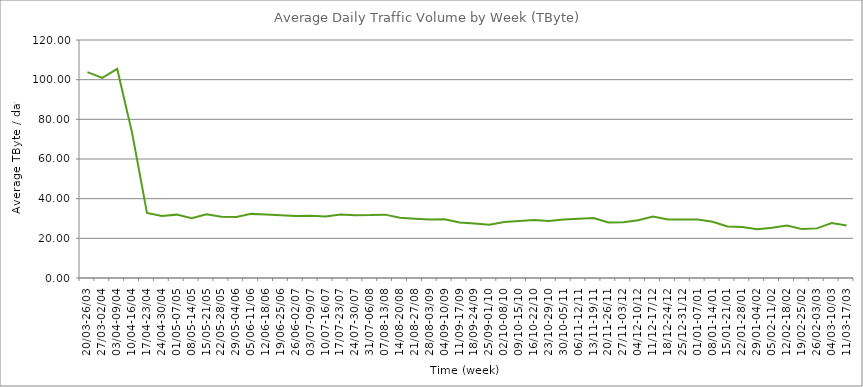
| Category | Average |
|---|---|
| 20/03-26/03 | 103.77 |
| 27/03-02/04 | 100.93 |
| 03/04-09/04 | 105.42 |
| 10/04-16/04 | 73.17 |
| 17/04-23/04 | 32.84 |
| 24/04-30/04 | 31.3 |
| 01/05-07/05 | 31.95 |
| 08/05-14/05 | 30.09 |
| 15/05-21/05 | 32.17 |
| 22/05-28/05 | 30.88 |
| 29/05-04/06 | 30.72 |
| 05/06-11/06 | 32.33 |
| 12/06-18/06 | 31.99 |
| 19/06-25/06 | 31.65 |
| 26/06-02/07 | 31.24 |
| 03/07-09/07 | 31.42 |
| 10/07-16/07 | 31.03 |
| 17/07-23/07 | 32.02 |
| 24/07-30/07 | 31.64 |
| 31/07-06/08 | 31.71 |
| 07/08-13/08 | 31.95 |
| 14/08-20/08 | 30.36 |
| 21/08-27/08 | 29.91 |
| 28/08-03/09 | 29.54 |
| 04/09-10/09 | 29.62 |
| 11/09-17/09 | 28.01 |
| 18/09-24/09 | 27.46 |
| 25/09-01/10 | 26.87 |
| 02/10-08/10 | 28.22 |
| 09/10-15/10 | 28.72 |
| 16/10-22/10 | 29.21 |
| 23/10-29/10 | 28.77 |
| 30/10-05/11 | 29.53 |
| 06/11-12/11 | 29.87 |
| 13/11-19/11 | 30.29 |
| 20/11-26/11 | 28.02 |
| 27/11-03/12 | 28.15 |
| 04/12-10/12 | 29.08 |
| 11/12-17/12 | 30.95 |
| 18/12-24/12 | 29.53 |
| 25/12-31/12 | 29.54 |
| 01/01-07/01 | 29.54 |
| 08/01-14/01 | 28.38 |
| 15/01-21/01 | 26 |
| 22/01-28/01 | 25.68 |
| 29/01-04/02 | 24.55 |
| 05/02-11/02 | 25.33 |
| 12/02-18/02 | 26.47 |
| 19/02-25/02 | 24.65 |
| 26/02-03/03 | 25.02 |
| 04/03-10/03 | 27.71 |
| 11/03-17/03 | 26.48 |